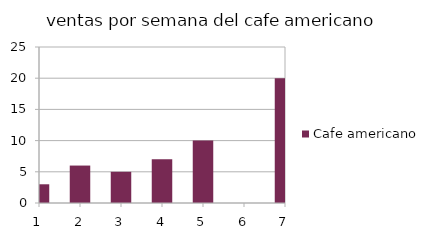
| Category | Cafe americano |
|---|---|
| 1 | 3 |
| 2 | 6 |
| 3 | 5 |
| 4 | 7 |
| 5 | 10 |
| 6 | 0 |
| 7 | 20 |